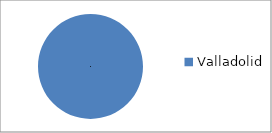
| Category | Series 0 |
|---|---|
| Valladolid | 6 |